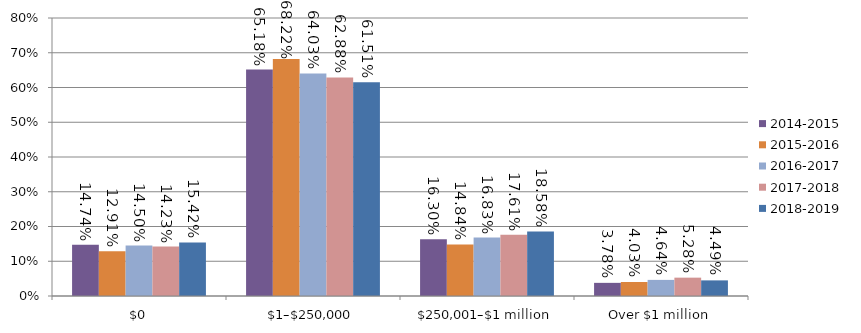
| Category | 2014-2015 | 2015-2016 | 2016-2017 | 2017-2018 | 2018-2019 |
|---|---|---|---|---|---|
| $0 | 0.147 | 0.129 | 0.145 | 0.142 | 0.154 |
| $1–$250,000 | 0.652 | 0.682 | 0.64 | 0.629 | 0.615 |
| $250,001–$1 million | 0.163 | 0.148 | 0.168 | 0.176 | 0.186 |
| Over $1 million | 0.038 | 0.04 | 0.046 | 0.053 | 0.045 |